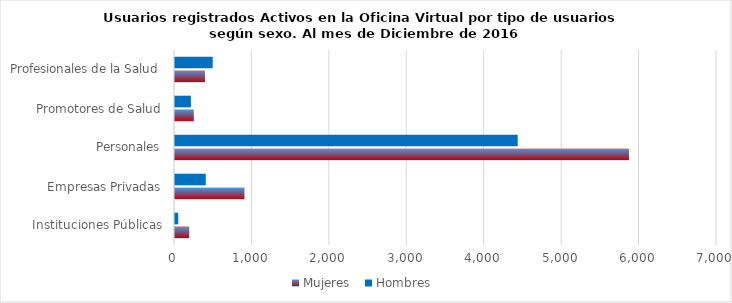
| Category | Mujeres | Hombres |
|---|---|---|
| Instituciones Públicas | 184 | 42 |
| Empresas Privadas | 897 | 397 |
| Personales | 5863 | 4426 |
| Promotores de Salud | 243 | 205 |
| Profesionales de la Salud | 387 | 487 |